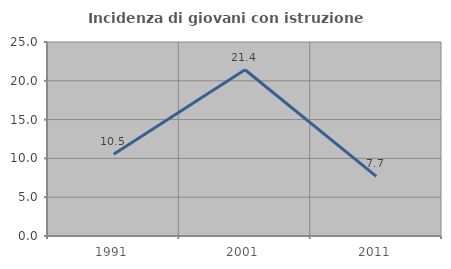
| Category | Incidenza di giovani con istruzione universitaria |
|---|---|
| 1991.0 | 10.526 |
| 2001.0 | 21.429 |
| 2011.0 | 7.692 |